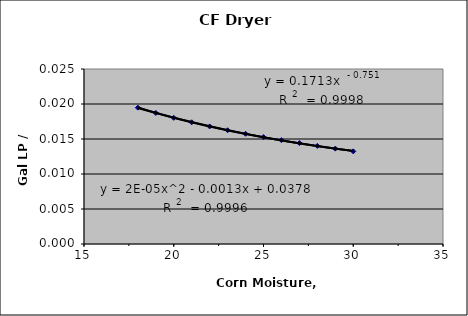
| Category | Series 0 |
|---|---|
| 18.0 | 0.019 |
| 19.0 | 0.019 |
| 20.0 | 0.018 |
| 21.0 | 0.017 |
| 22.0 | 0.017 |
| 23.0 | 0.016 |
| 24.0 | 0.016 |
| 25.0 | 0.015 |
| 26.0 | 0.015 |
| 27.0 | 0.014 |
| 28.0 | 0.014 |
| 29.0 | 0.014 |
| 30.0 | 0.013 |